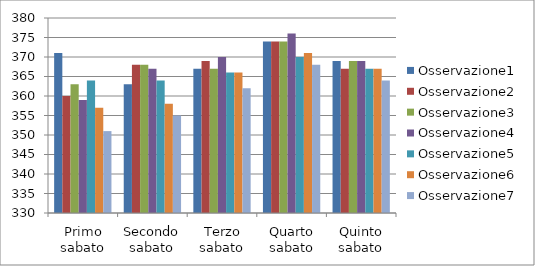
| Category | Osservazione1 | Osservazione2 | Osservazione3 | Osservazione4 | Osservazione5 | Osservazione6 | Osservazione7 |
|---|---|---|---|---|---|---|---|
| Primo sabato | 371 | 360 | 363 | 359 | 364 | 357 | 351 |
| Secondo sabato | 363 | 368 | 368 | 367 | 364 | 358 | 355 |
| Terzo sabato | 367 | 369 | 367 | 370 | 366 | 366 | 362 |
| Quarto sabato | 374 | 374 | 374 | 376 | 370 | 371 | 368 |
| Quinto sabato | 369 | 367 | 369 | 369 | 367 | 367 | 364 |